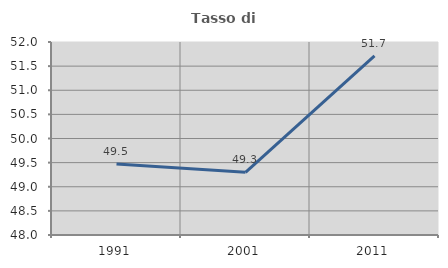
| Category | Tasso di occupazione   |
|---|---|
| 1991.0 | 49.472 |
| 2001.0 | 49.299 |
| 2011.0 | 51.712 |